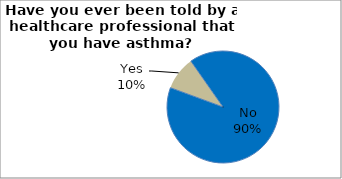
| Category | Series 0 |
|---|---|
| No | 90.323 |
| Yes | 9.677 |